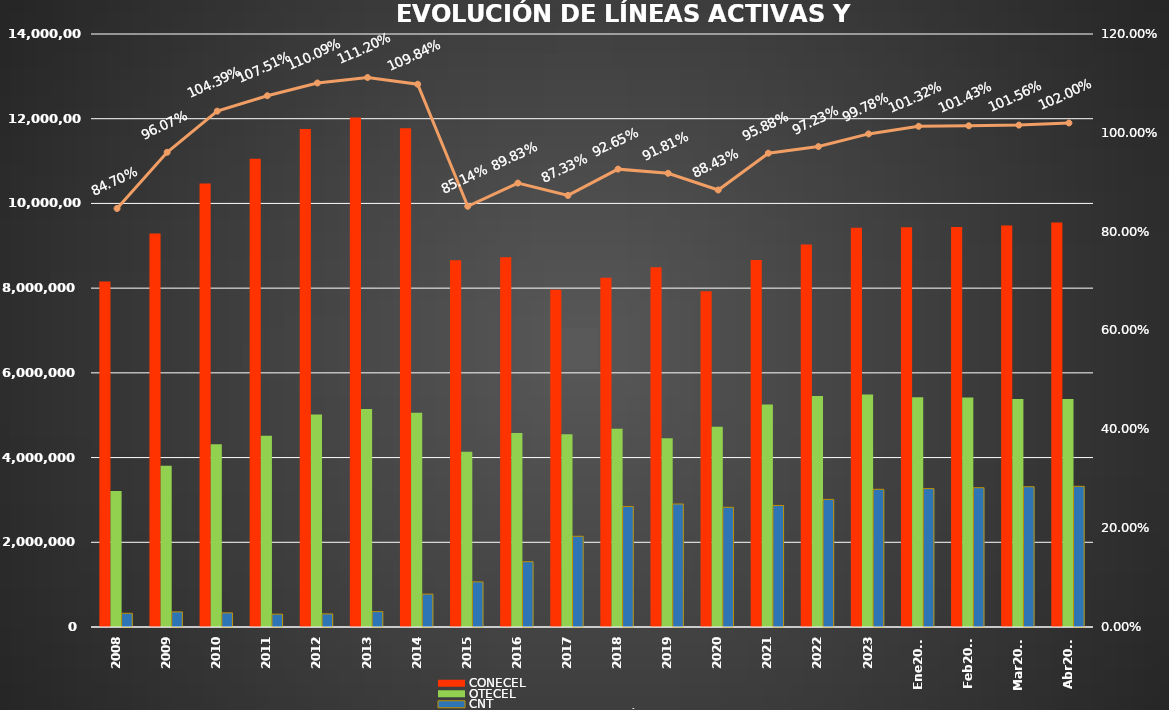
| Category | CONECEL | OTECEL | CNT |
|---|---|---|---|
| 2008 | 8156359 | 3211922 | 323967 |
| 2009 | 9291268 | 3806432 | 356900 |
| 2010 | 10470502 | 4314599 | 333730 |
| 2011 | 11057316 | 4513874 | 303368 |
| 2012 | 11757906 | 5019686 | 309271 |
| 2013 | 12030886 | 5148308 | 362560 |
| 2014 | 11772020 | 5055645 | 776892 |
| 2015 | 8658619 | 4134698 | 1065703 |
| 2016 | 8726823 | 4580092 | 1541219 |
| 2017 | 7960263 | 4549024 | 2142117 |
| 2018 | 8248050 | 4679646 | 2845142 |
| 2019 | 8493054 | 4456356 | 2903690 |
| 2020 | 7929253 | 4729725 | 2826388 |
| 2021 | 8665715 | 5254468 | 2869417 |
| 2022 | 9027737 | 5451115 | 3011899 |
| 2023 | 9425714 | 5489576 | 3250322 |
| Ene2024 | 9435179 | 5426792 | 3267658 |
| Feb2024 | 9444024 | 5416623 | 3288468 |
| Mar2024 | 9479113 | 5381714 | 3311950 |
| Abr2024 | 9547573 | 5381714 | 3321223 |